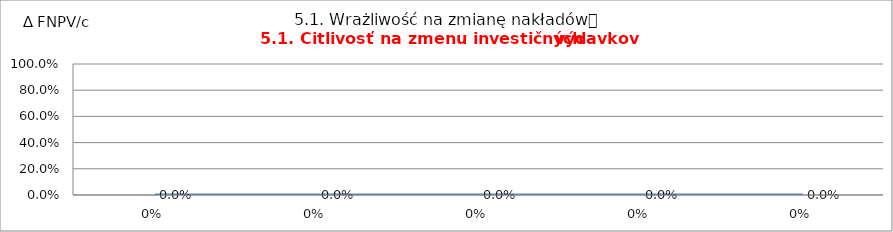
| Category | 5.1. Wrażliwość na zmianę nakładów
5.1. Citlivosť na zmenu investičných výdavkov |
|---|---|
| 0.0 | 0 |
| 0.0 | 0 |
| 0.0 | 0 |
| 0.0 | 0 |
| 0.0 | 0 |